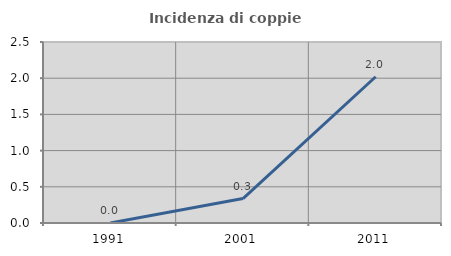
| Category | Incidenza di coppie miste |
|---|---|
| 1991.0 | 0 |
| 2001.0 | 0.338 |
| 2011.0 | 2.02 |